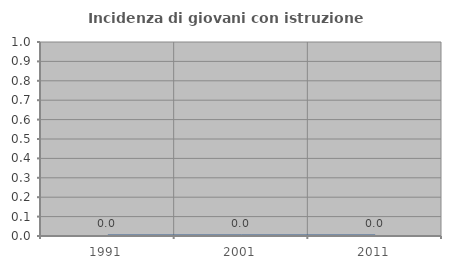
| Category | Incidenza di giovani con istruzione universitaria |
|---|---|
| 1991.0 | 0 |
| 2001.0 | 0 |
| 2011.0 | 0 |